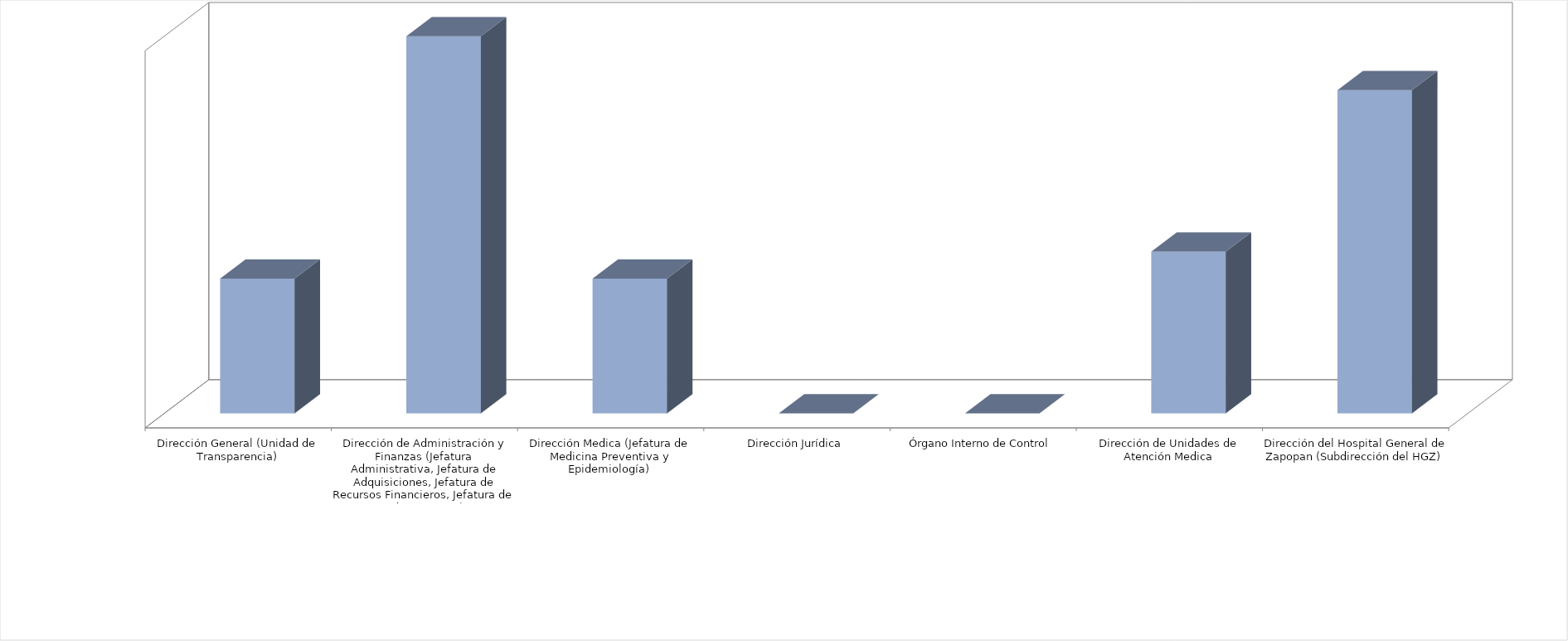
| Category | Series 0 | Series 1 |
|---|---|---|
| Dirección General (Unidad de Transparencia) |  | 5 |
| Dirección de Administración y Finanzas (Jefatura Administrativa, Jefatura de Adquisiciones, Jefatura de Recursos Financieros, Jefatura de Adquisiciones) |  | 14 |
| Dirección Medica (Jefatura de Medicina Preventiva y Epidemiología)  |  | 5 |
| Dirección Jurídica |  | 0 |
| Órgano Interno de Control |  | 0 |
| Dirección de Unidades de Atención Medica |  | 6 |
| Dirección del Hospital General de Zapopan (Subdirección del HGZ) |  | 12 |